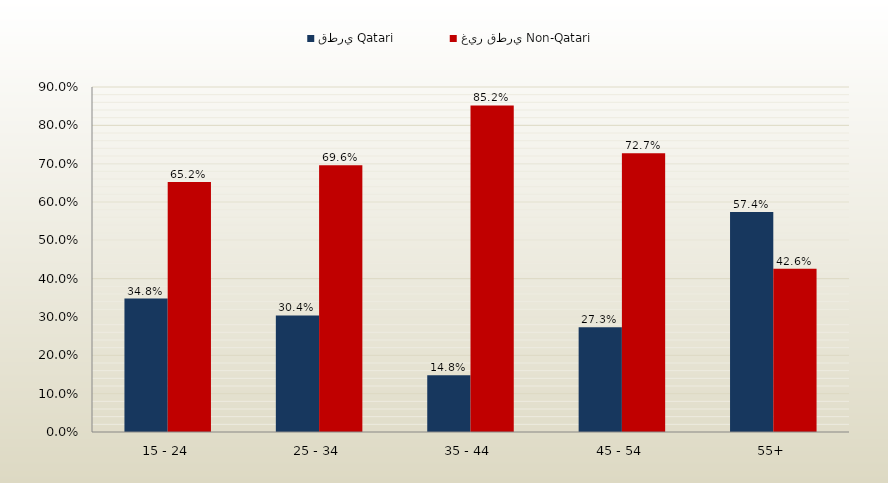
| Category | قطري Qatari | غير قطري Non-Qatari |
|---|---|---|
| 15 - 24 | 0.348 | 0.652 |
| 25 - 34 | 0.304 | 0.696 |
| 35 - 44 | 0.148 | 0.852 |
| 45 - 54 | 0.273 | 0.727 |
| 55+ | 0.574 | 0.426 |